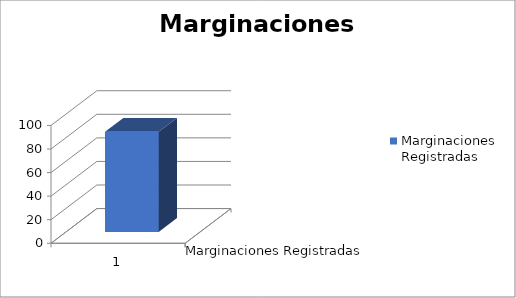
| Category | Marginaciones Registradas |
|---|---|
| 0 | 85 |